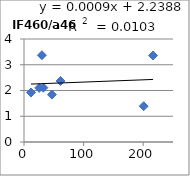
| Category | IF460/a460 |
|---|---|
| 25.5 | 2.1 |
| 61.3 | 2.37 |
| 11.7 | 1.92 |
| 216.5 | 3.36 |
| 46.8 | 1.84 |
| 32.5 | 2.11 |
| 200.8 | 1.39 |
| 30.1 | 3.37 |